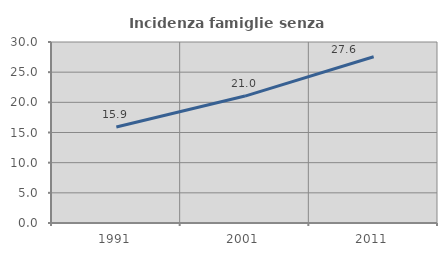
| Category | Incidenza famiglie senza nuclei |
|---|---|
| 1991.0 | 15.899 |
| 2001.0 | 21.037 |
| 2011.0 | 27.561 |